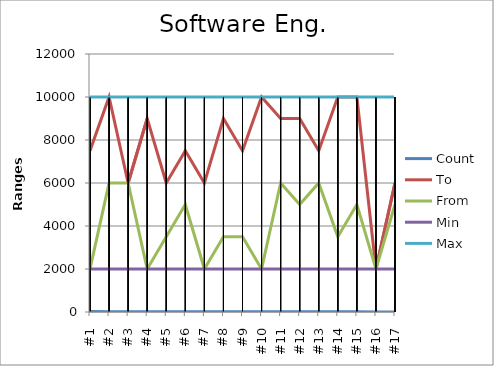
| Category | Count | To | From | Min | Max |
|---|---|---|---|---|---|
| #1 | 18 | 7500 | 2000 | 2000 | 10000 |
| #2 | 16 | 10000 | 6000 | 2000 | 10000 |
| #3 | 13 | 6000 | 6000 | 2000 | 10000 |
| #4 | 12 | 9000 | 2000 | 2000 | 10000 |
| #5 | 11 | 6000 | 3500 | 2000 | 10000 |
| #6 | 10 | 7500 | 5000 | 2000 | 10000 |
| #7 | 10 | 6000 | 2000 | 2000 | 10000 |
| #8 | 8 | 9000 | 3500 | 2000 | 10000 |
| #9 | 8 | 7500 | 3500 | 2000 | 10000 |
| #10 | 8 | 10000 | 2000 | 2000 | 10000 |
| #11 | 8 | 9000 | 6000 | 2000 | 10000 |
| #12 | 7 | 9000 | 5000 | 2000 | 10000 |
| #13 | 7 | 7500 | 6000 | 2000 | 10000 |
| #14 | 7 | 10000 | 3500 | 2000 | 10000 |
| #15 | 6 | 10000 | 5000 | 2000 | 10000 |
| #16 | 5 | 2000 | 2000 | 2000 | 10000 |
| #17 | 4 | 6000 | 5000 | 2000 | 10000 |